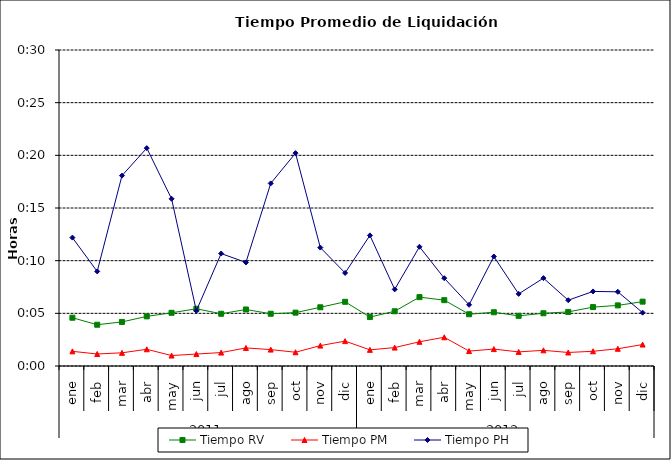
| Category | Tiempo RV | Tiempo PM | Tiempo PH |
|---|---|---|---|
| 0 | 0.003 | 0.001 | 0.009 |
| 1 | 0.003 | 0.001 | 0.006 |
| 2 | 0.003 | 0.001 | 0.013 |
| 3 | 0.003 | 0.001 | 0.014 |
| 4 | 0.004 | 0.001 | 0.011 |
| 5 | 0.004 | 0.001 | 0.004 |
| 6 | 0.003 | 0.001 | 0.007 |
| 7 | 0.004 | 0.001 | 0.007 |
| 8 | 0.003 | 0.001 | 0.012 |
| 9 | 0.004 | 0.001 | 0.014 |
| 10 | 0.004 | 0.001 | 0.008 |
| 11 | 0.004 | 0.002 | 0.006 |
| 12 | 0.003 | 0.001 | 0.009 |
| 13 | 0.004 | 0.001 | 0.005 |
| 14 | 0.005 | 0.002 | 0.008 |
| 15 | 0.004 | 0.002 | 0.006 |
| 16 | 0.003 | 0.001 | 0.004 |
| 17 | 0.004 | 0.001 | 0.007 |
| 18 | 0.003 | 0.001 | 0.005 |
| 19 | 0.004 | 0.001 | 0.006 |
| 20 | 0.004 | 0.001 | 0.004 |
| 21 | 0.004 | 0.001 | 0.005 |
| 22 | 0.004 | 0.001 | 0.005 |
| 23 | 0.004 | 0.001 | 0.004 |